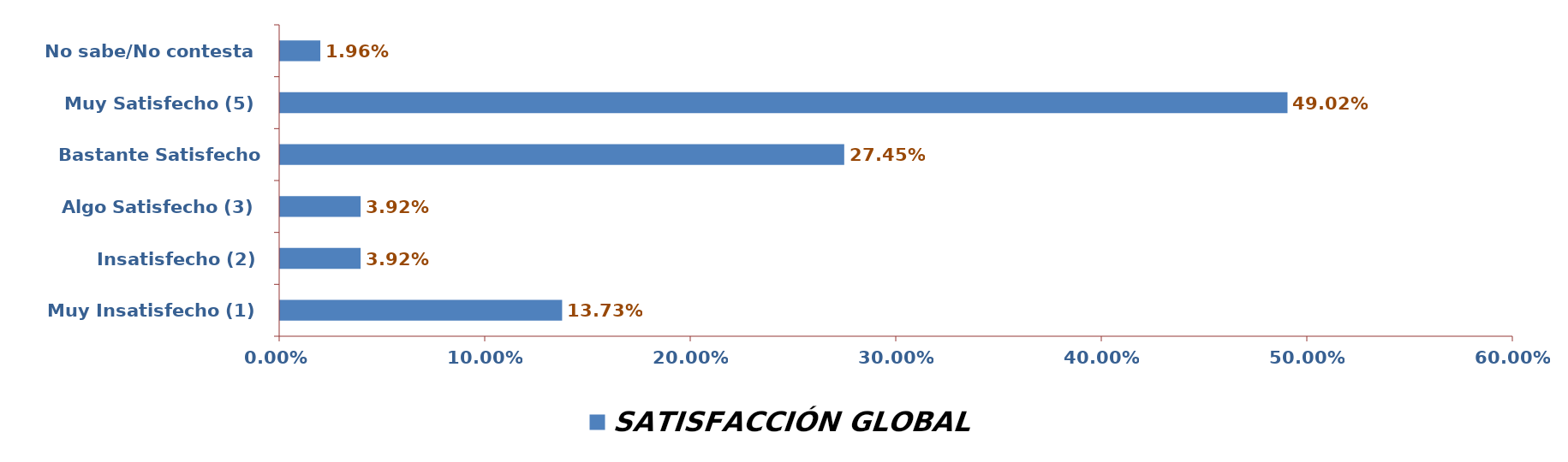
| Category | SATISFACCIÓN GLOBAL |
|---|---|
| Muy Insatisfecho (1) | 0.137 |
| Insatisfecho (2) | 0.039 |
| Algo Satisfecho (3) | 0.039 |
| Bastante Satisfecho (4) | 0.275 |
| Muy Satisfecho (5) | 0.49 |
| No sabe/No contesta | 0.02 |